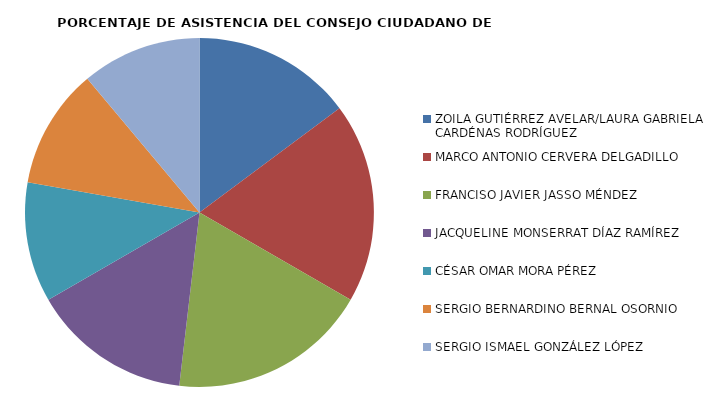
| Category | Series 0 |
|---|---|
| ZOILA GUTIÉRREZ AVELAR/LAURA GABRIELA CARDÉNAS RODRÍGUEZ | 80 |
| MARCO ANTONIO CERVERA DELGADILLO | 100 |
| FRANCISO JAVIER JASSO MÉNDEZ | 100 |
| JACQUELINE MONSERRAT DÍAZ RAMÍREZ | 80 |
| CÉSAR OMAR MORA PÉREZ | 60 |
| SERGIO BERNARDINO BERNAL OSORNIO | 60 |
| SERGIO ISMAEL GONZÁLEZ LÓPEZ | 60 |